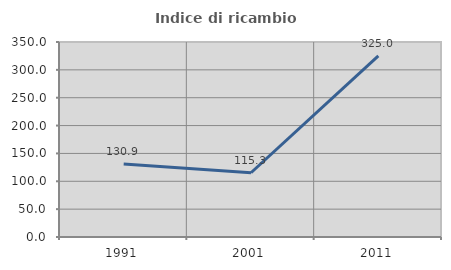
| Category | Indice di ricambio occupazionale  |
|---|---|
| 1991.0 | 130.864 |
| 2001.0 | 115.306 |
| 2011.0 | 325 |